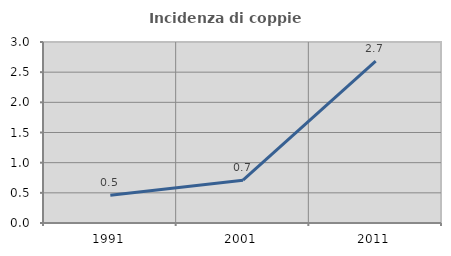
| Category | Incidenza di coppie miste |
|---|---|
| 1991.0 | 0.459 |
| 2001.0 | 0.71 |
| 2011.0 | 2.684 |